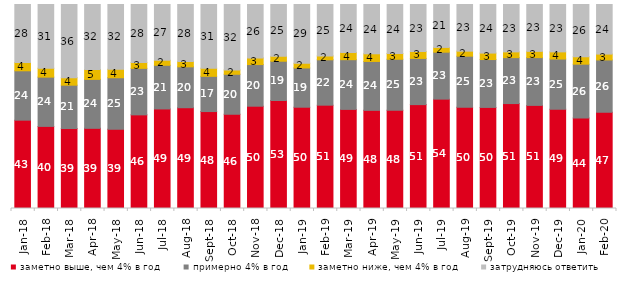
| Category | заметно выше, чем 4% в год | примерно 4% в год | заметно ниже, чем 4% в год | затрудняюсь ответить |
|---|---|---|---|---|
| 2018-01-01 | 43.3 | 24.2 | 4.05 | 28.45 |
| 2018-02-01 | 40.25 | 24.15 | 4.35 | 31.25 |
| 2018-03-01 | 39.2 | 21.25 | 3.7 | 35.85 |
| 2018-04-01 | 39.3 | 24 | 4.85 | 31.85 |
| 2018-05-01 | 38.8 | 25.3 | 4.15 | 31.75 |
| 2018-06-01 | 45.9 | 22.8 | 2.85 | 28.45 |
| 2018-07-01 | 48.8 | 21.4 | 2.45 | 27.35 |
| 2018-08-01 | 49.4 | 20.05 | 2.55 | 28 |
| 2018-09-01 | 47.5 | 17.25 | 4 | 31.2 |
| 2018-10-01 | 46.2 | 19.6 | 2.15 | 32.05 |
| 2018-11-01 | 50.15 | 20.409 | 3.244 | 26.198 |
| 2018-12-01 | 52.95 | 19.25 | 2.4 | 25.4 |
| 2019-01-01 | 49.65 | 19.25 | 2.3 | 28.8 |
| 2019-02-01 | 50.65 | 22.25 | 1.9 | 25.2 |
| 2019-03-01 | 48.583 | 24.366 | 3.531 | 23.521 |
| 2019-04-01 | 48.119 | 23.96 | 3.762 | 24.158 |
| 2019-05-01 | 48.143 | 25.012 | 2.823 | 24.022 |
| 2019-06-01 | 50.923 | 22.643 | 3.392 | 23.042 |
| 2019-07-01 | 53.614 | 23.02 | 2.327 | 21.04 |
| 2019-08-01 | 49.65 | 25.025 | 2.448 | 22.877 |
| 2019-09-01 | 49.554 | 23.465 | 3.168 | 23.812 |
| 2019-10-01 | 51.436 | 22.525 | 2.822 | 23.218 |
| 2019-11-01 | 50.545 | 23.416 | 3.069 | 22.97 |
| 2019-12-01 | 48.663 | 24.604 | 3.515 | 23.218 |
| 2020-01-01 | 44.307 | 26.436 | 3.614 | 25.644 |
| 2020-02-01 | 47.178 | 25.644 | 2.871 | 24.307 |